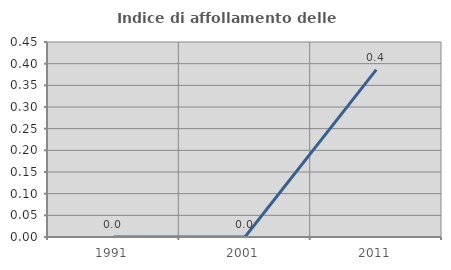
| Category | Indice di affollamento delle abitazioni  |
|---|---|
| 1991.0 | 0 |
| 2001.0 | 0 |
| 2011.0 | 0.386 |